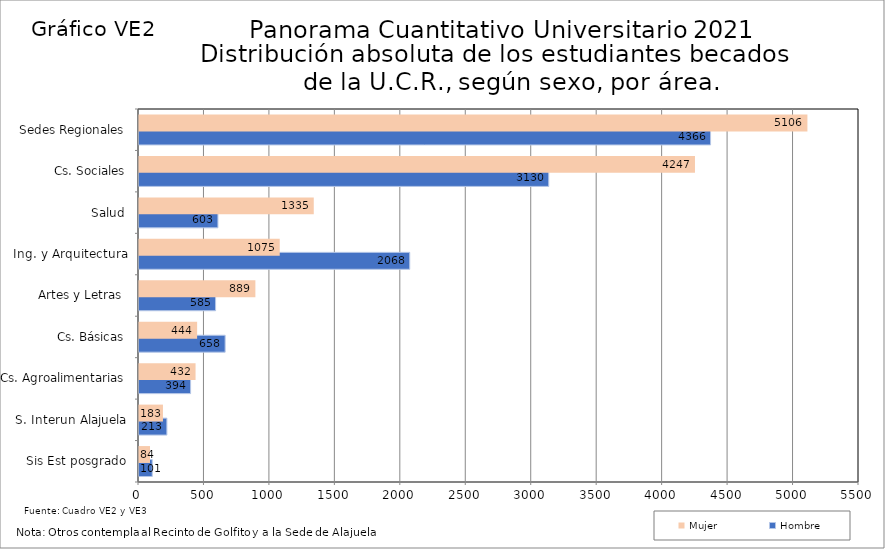
| Category | Hombre | Mujer |
|---|---|---|
| Sis Est posgrado | 101 | 84 |
| S. Interun Alajuela | 213 | 183 |
| Cs. Agroalimentarias | 394 | 432 |
| Cs. Básicas | 658 | 444 |
| Artes y Letras  | 585 | 889 |
| Ing. y Arquitectura | 2068 | 1075 |
| Salud | 603 | 1335 |
| Cs. Sociales | 3130 | 4247 |
| Sedes Regionales | 4366 | 5106 |